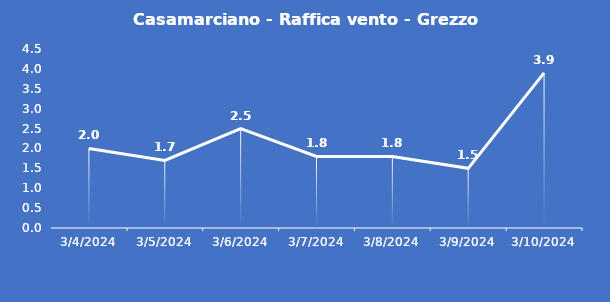
| Category | Casamarciano - Raffica vento - Grezzo (m/s) |
|---|---|
| 3/4/24 | 2 |
| 3/5/24 | 1.7 |
| 3/6/24 | 2.5 |
| 3/7/24 | 1.8 |
| 3/8/24 | 1.8 |
| 3/9/24 | 1.5 |
| 3/10/24 | 3.9 |